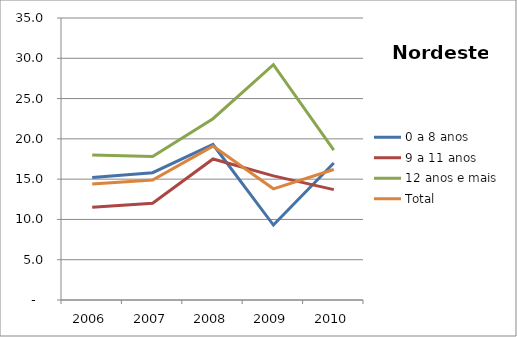
| Category | 0 a 8 anos | 9 a 11 anos | 12 anos e mais | Total |
|---|---|---|---|---|
| 2006.0 | 15.2 | 11.5 | 18 | 14.4 |
| 2007.0 | 15.8 | 12 | 17.8 | 14.9 |
| 2008.0 | 19.3 | 17.5 | 22.5 | 19.1 |
| 2009.0 | 9.3 | 15.4 | 29.2 | 13.8 |
| 2010.0 | 17 | 13.7 | 18.6 | 16.2 |